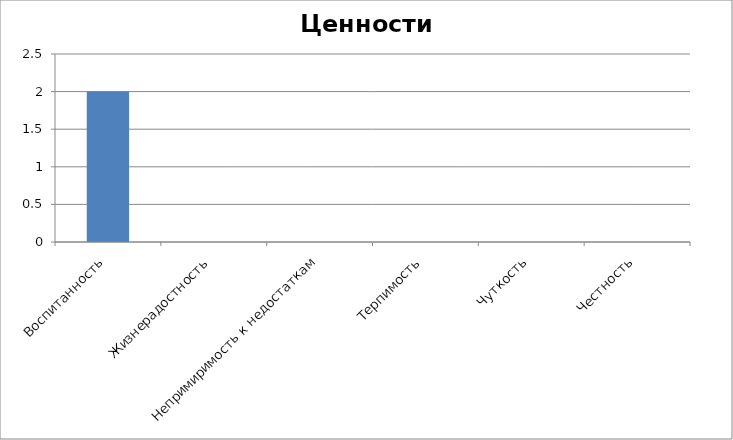
| Category | Ценности общения |
|---|---|
| Воспитанность | 2 |
| Жизнерадостность | 0 |
| Непримиримость к недостаткам | 0 |
| Терпимость | 0 |
| Чуткость | 0 |
| Честность | 0 |